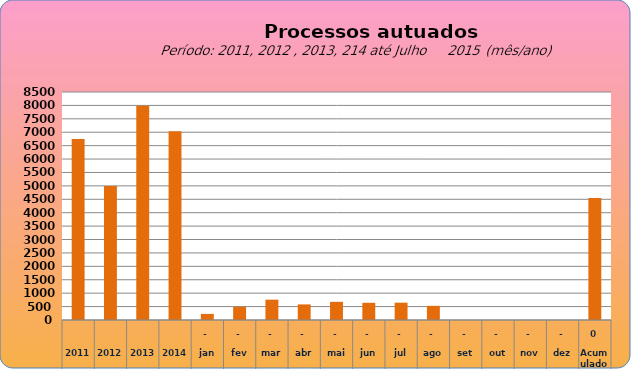
| Category | 6749 4997 7990 7034  228   486   758   581   676   641   646   527   -     -     -     -     4.543  |
|---|---|
| 2011 | 6749 |
| 2012 | 4997 |
| 2013 | 7990 |
| 2014 | 7034 |
| jan | 228 |
| fev | 492 |
| mar | 758 |
| abr | 581 |
| mai | 677 |
| jun | 641 |
| jul | 646 |
| ago | 527 |
| set | 0 |
| out | 0 |
| nov | 0 |
| dez | 0 |
| Acumulado
 | 4550 |